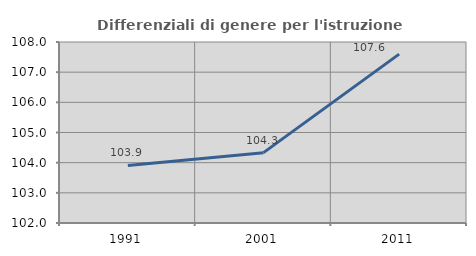
| Category | Differenziali di genere per l'istruzione superiore |
|---|---|
| 1991.0 | 103.908 |
| 2001.0 | 104.332 |
| 2011.0 | 107.598 |